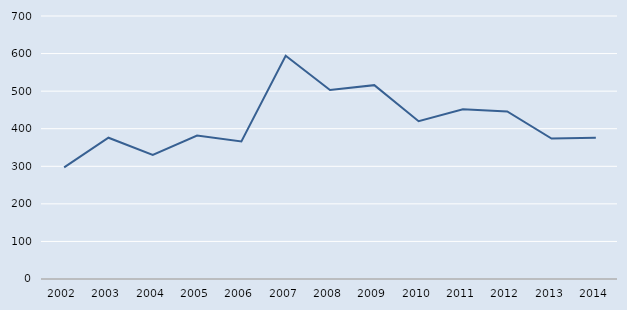
| Category | Series 0 |
|---|---|
| 2002.0 | 297 |
| 2003.0 | 376 |
| 2004.0 | 330 |
| 2005.0 | 382 |
| 2006.0 | 366 |
| 2007.0 | 594 |
| 2008.0 | 503 |
| 2009.0 | 516 |
| 2010.0 | 420 |
| 2011.0 | 452 |
| 2012.0 | 446 |
| 2013.0 | 374 |
| 2014.0 | 376 |